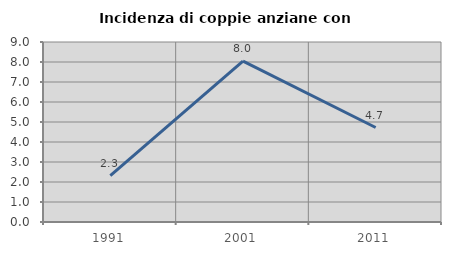
| Category | Incidenza di coppie anziane con figli |
|---|---|
| 1991.0 | 2.315 |
| 2001.0 | 8.046 |
| 2011.0 | 4.724 |